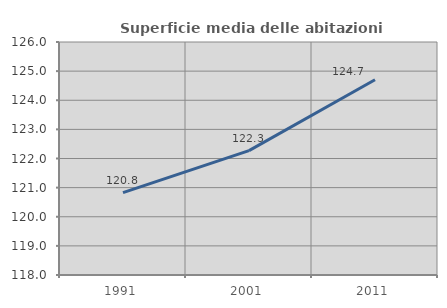
| Category | Superficie media delle abitazioni occupate |
|---|---|
| 1991.0 | 120.83 |
| 2001.0 | 122.269 |
| 2011.0 | 124.705 |